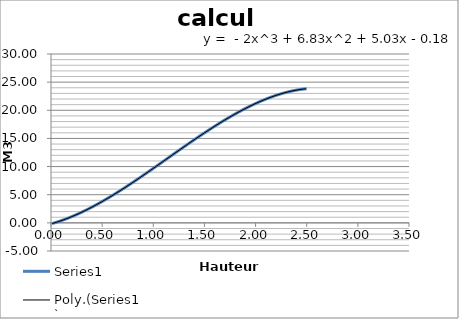
| Category | Series 0 |
|---|---|
| 0.01 | -0.129 |
| 0.02 | -0.077 |
| 0.03 | -0.023 |
| 0.04 | 0.032 |
| 0.05 | 0.088 |
| 0.06 | 0.146 |
| 0.07 | 0.205 |
| 0.08 | 0.265 |
| 0.09 | 0.327 |
| 0.1 | 0.389 |
| 0.11 | 0.453 |
| 0.12 | 0.518 |
| 0.13 | 0.585 |
| 0.14 | 0.653 |
| 0.15 | 0.721 |
| 0.16 | 0.791 |
| 0.17 | 0.863 |
| 0.18 | 0.935 |
| 0.19 | 1.009 |
| 0.2 | 1.083 |
| 0.21 | 1.159 |
| 0.22 | 1.236 |
| 0.23 | 1.314 |
| 0.24 | 1.393 |
| 0.25 | 1.473 |
| 0.26 | 1.554 |
| 0.27 | 1.637 |
| 0.28 | 1.72 |
| 0.29 | 1.804 |
| 0.3 | 1.89 |
| 0.31 | 1.976 |
| 0.32 | 2.063 |
| 0.33 | 2.152 |
| 0.34 | 2.241 |
| 0.35 | 2.331 |
| 0.36 | 2.423 |
| 0.37 | 2.515 |
| 0.38 | 2.608 |
| 0.39 | 2.702 |
| 0.4 | 2.797 |
| 0.41 | 2.893 |
| 0.42 | 2.989 |
| 0.43 | 3.087 |
| 0.44 | 3.185 |
| 0.45 | 3.284 |
| 0.46 | 3.384 |
| 0.47 | 3.485 |
| 0.48 | 3.587 |
| 0.49 | 3.689 |
| 0.5 | 3.792 |
| 0.51 | 3.896 |
| 0.52 | 4.001 |
| 0.53 | 4.107 |
| 0.54 | 4.213 |
| 0.55 | 4.32 |
| 0.56 | 4.427 |
| 0.57 | 4.536 |
| 0.58 | 4.645 |
| 0.59 | 4.754 |
| 0.6 | 4.865 |
| 0.61 | 4.976 |
| 0.62 | 5.087 |
| 0.63 | 5.2 |
| 0.64 | 5.312 |
| 0.65 | 5.426 |
| 0.66 | 5.54 |
| 0.67 | 5.655 |
| 0.68 | 5.77 |
| 0.69 | 5.885 |
| 0.7 | 6.002 |
| 0.71 | 6.118 |
| 0.72 | 6.236 |
| 0.73 | 6.354 |
| 0.74 | 6.472 |
| 0.75 | 6.591 |
| 0.76 | 6.71 |
| 0.77 | 6.83 |
| 0.78 | 6.95 |
| 0.79 | 7.07 |
| 0.8 | 7.191 |
| 0.81 | 7.313 |
| 0.82 | 7.434 |
| 0.83 | 7.557 |
| 0.84 | 7.679 |
| 0.85 | 7.802 |
| 0.86 | 7.925 |
| 0.87 | 8.049 |
| 0.88 | 8.173 |
| 0.89 | 8.297 |
| 0.9 | 8.421 |
| 0.91 | 8.546 |
| 0.92 | 8.671 |
| 0.93 | 8.796 |
| 0.94 | 8.922 |
| 0.95 | 9.048 |
| 0.96 | 9.174 |
| 0.97 | 9.3 |
| 0.98 | 9.427 |
| 0.99 | 9.553 |
| 1.0 | 9.68 |
| 1.01 | 9.807 |
| 1.02 | 9.934 |
| 1.03 | 10.061 |
| 1.04 | 10.189 |
| 1.05 | 10.316 |
| 1.06 | 10.444 |
| 1.07 | 10.572 |
| 1.08 | 10.699 |
| 1.09 | 10.827 |
| 1.1 | 10.955 |
| 1.11 | 11.083 |
| 1.12 | 11.211 |
| 1.13 | 11.339 |
| 1.14 | 11.467 |
| 1.15 | 11.595 |
| 1.16 | 11.723 |
| 1.17 | 11.851 |
| 1.18 | 11.979 |
| 1.19 | 12.107 |
| 1.2 | 12.235 |
| 1.21 | 12.363 |
| 1.22 | 12.491 |
| 1.23 | 12.618 |
| 1.24 | 12.746 |
| 1.25 | 12.873 |
| 1.26 | 13 |
| 1.27 | 13.127 |
| 1.28 | 13.254 |
| 1.29 | 13.381 |
| 1.3 | 13.508 |
| 1.31 | 13.634 |
| 1.32 | 13.76 |
| 1.33 | 13.886 |
| 1.34 | 14.012 |
| 1.35 | 14.137 |
| 1.36 | 14.263 |
| 1.37 | 14.388 |
| 1.38 | 14.512 |
| 1.39 | 14.637 |
| 1.4 | 14.761 |
| 1.41 | 14.885 |
| 1.42 | 15.008 |
| 1.43 | 15.131 |
| 1.44 | 15.254 |
| 1.45 | 15.376 |
| 1.46 | 15.498 |
| 1.47 | 15.62 |
| 1.48 | 15.741 |
| 1.49 | 15.862 |
| 1.5 | 15.983 |
| 1.51 | 16.102 |
| 1.52 | 16.222 |
| 1.53 | 16.341 |
| 1.54 | 16.46 |
| 1.55 | 16.578 |
| 1.56 | 16.695 |
| 1.57 | 16.813 |
| 1.58 | 16.929 |
| 1.59 | 17.045 |
| 1.6 | 17.161 |
| 1.61 | 17.276 |
| 1.62 | 17.39 |
| 1.63 | 17.504 |
| 1.64 | 17.617 |
| 1.65 | 17.73 |
| 1.66 | 17.842 |
| 1.67 | 17.953 |
| 1.68 | 18.064 |
| 1.69 | 18.174 |
| 1.7 | 18.284 |
| 1.71 | 18.392 |
| 1.72 | 18.501 |
| 1.73 | 18.608 |
| 1.74 | 18.715 |
| 1.75 | 18.821 |
| 1.76 | 18.926 |
| 1.77 | 19.03 |
| 1.78 | 19.134 |
| 1.79 | 19.237 |
| 1.8 | 19.339 |
| 1.81 | 19.441 |
| 1.82 | 19.541 |
| 1.83 | 19.641 |
| 1.84 | 19.74 |
| 1.85 | 19.838 |
| 1.86 | 19.935 |
| 1.87 | 20.032 |
| 1.88 | 20.127 |
| 1.89 | 20.222 |
| 1.9 | 20.315 |
| 1.91 | 20.408 |
| 1.92 | 20.5 |
| 1.93 | 20.591 |
| 1.94 | 20.681 |
| 1.95 | 20.77 |
| 1.96 | 20.858 |
| 1.97 | 20.945 |
| 1.98 | 21.031 |
| 1.99 | 21.116 |
| 2.0 | 21.2 |
| 2.01 | 21.283 |
| 2.02 | 21.365 |
| 2.03 | 21.446 |
| 2.04 | 21.526 |
| 2.05 | 21.604 |
| 2.06 | 21.682 |
| 2.07 | 21.758 |
| 2.08 | 21.834 |
| 2.09 | 21.908 |
| 2.1 | 21.981 |
| 2.11 | 22.053 |
| 2.12 | 22.124 |
| 2.13 | 22.194 |
| 2.14 | 22.262 |
| 2.15 | 22.329 |
| 2.16 | 22.395 |
| 2.17 | 22.46 |
| 2.18 | 22.524 |
| 2.19 | 22.586 |
| 2.2 | 22.647 |
| 2.21 | 22.707 |
| 2.22 | 22.765 |
| 2.23 | 22.823 |
| 2.24 | 22.879 |
| 2.25 | 22.933 |
| 2.26 | 22.986 |
| 2.27 | 23.038 |
| 2.28 | 23.089 |
| 2.29 | 23.138 |
| 2.3 | 23.186 |
| 2.31 | 23.232 |
| 2.32 | 23.277 |
| 2.33 | 23.321 |
| 2.34 | 23.363 |
| 2.35 | 23.403 |
| 2.36 | 23.443 |
| 2.37 | 23.48 |
| 2.38 | 23.517 |
| 2.39 | 23.552 |
| 2.4 | 23.585 |
| 2.41 | 23.617 |
| 2.42 | 23.647 |
| 2.43 | 23.676 |
| 2.44 | 23.703 |
| 2.45 | 23.728 |
| 2.46 | 23.752 |
| 2.47 | 23.775 |
| 2.48 | 23.796 |
| 2.49 | 23.815 |
| 2.5 | 23.833 |